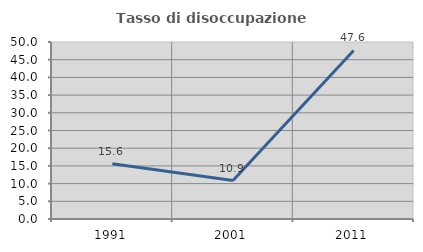
| Category | Tasso di disoccupazione giovanile  |
|---|---|
| 1991.0 | 15.584 |
| 2001.0 | 10.87 |
| 2011.0 | 47.619 |